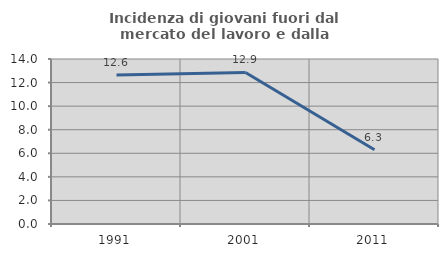
| Category | Incidenza di giovani fuori dal mercato del lavoro e dalla formazione  |
|---|---|
| 1991.0 | 12.637 |
| 2001.0 | 12.857 |
| 2011.0 | 6.306 |